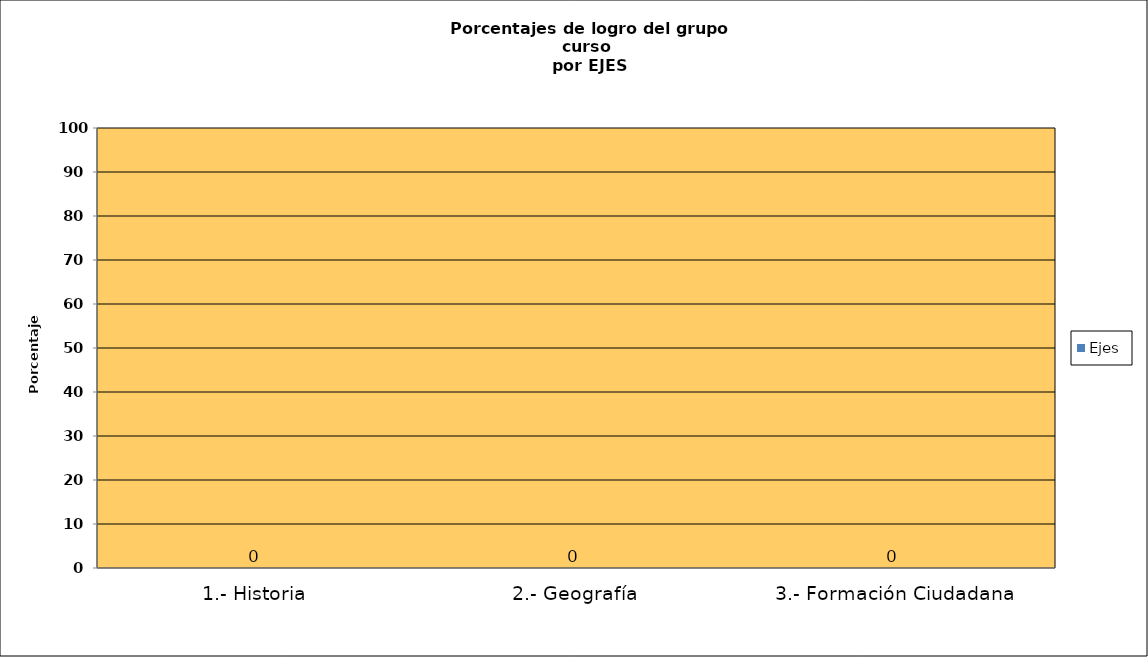
| Category | Ejes |
|---|---|
| 1.- Historia | 0 |
| 2.- Geografía | 0 |
| 3.- Formación Ciudadana | 0 |